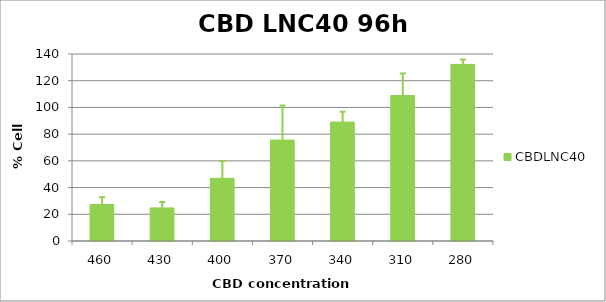
| Category | CBDLNC40 |
|---|---|
| 460.0 | 27.259 |
| 430.0 | 24.762 |
| 400.0 | 46.954 |
| 370.0 | 75.548 |
| 340.0 | 89.028 |
| 310.0 | 108.91 |
| 280.0 | 132.213 |